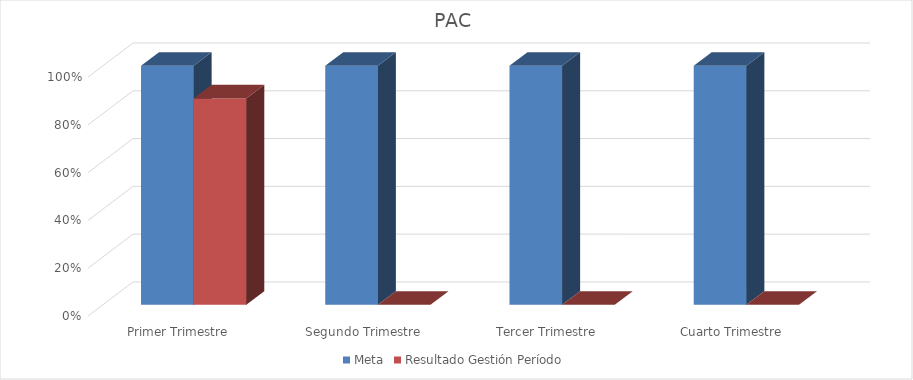
| Category | Meta | Resultado Gestión Período |
|---|---|---|
| Primer Trimestre | 1 | 0.864 |
| Segundo Trimestre | 1 | 0 |
| Tercer Trimestre | 1 | 0 |
| Cuarto Trimestre | 1 | 0 |